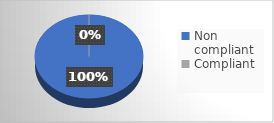
| Category | Series 0 |
|---|---|
| Non compliant | 7 |
| Compliant | 0 |